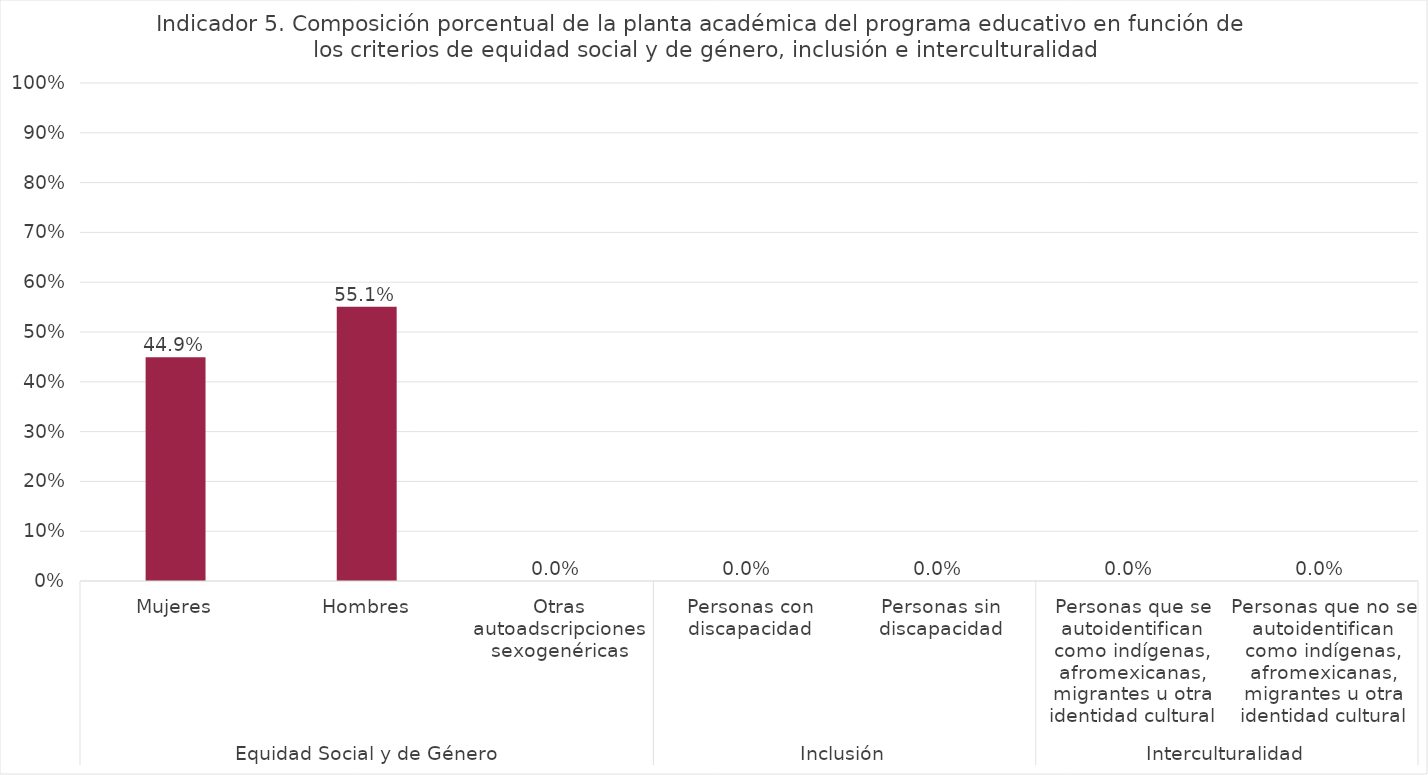
| Category | Docentes, investigadores |
|---|---|
| 0 | 0.449 |
| 1 | 0.551 |
| 2 | 0 |
| 3 | 0 |
| 4 | 0 |
| 5 | 0 |
| 6 | 0 |